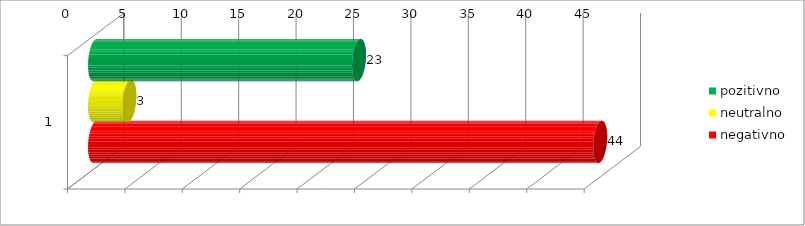
| Category | pozitivno | neutralno | negativno |
|---|---|---|---|
| 0 | 23 | 3 | 44 |